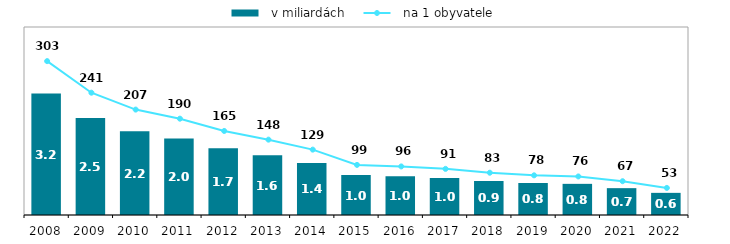
| Category |   v miliardách |
|---|---|
| 2008.0 | 3.17 |
| 2009.0 | 2.529 |
| 2010.0 | 2.185 |
| 2011.0 | 1.992 |
| 2012.0 | 1.739 |
| 2013.0 | 1.559 |
| 2014.0 | 1.356 |
| 2015.0 | 1.041 |
| 2016.0 | 1.011 |
| 2017.0 | 0.963 |
| 2018.0 | 0.886 |
| 2019.0 | 0.835 |
| 2020.0 | 0.812 |
| 2021.0 | 0.7 |
| 2022.0 | 0.577 |